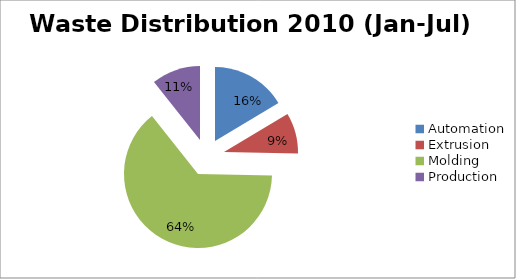
| Category | Series 0 |
|---|---|
| Automation | 35239.887 |
| Extrusion | 19205.745 |
| Molding | 137576.606 |
| Production | 22967.909 |